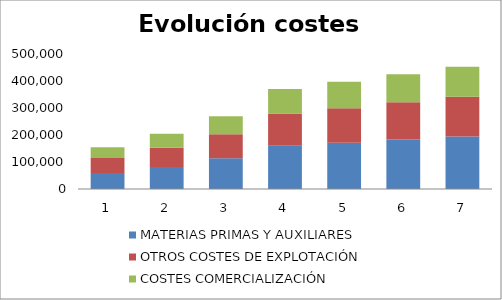
| Category | MATERIAS PRIMAS Y AUXILIARES | OTROS COSTES DE EXPLOTACIÓN | COSTES COMERCIALIZACIÓN |
|---|---|---|---|
| 0 | 59620 | 55100 | 40200 |
| 1 | 81227.56 | 71088.106 | 52510.494 |
| 2 | 113924.999 | 89048.551 | 66583.777 |
| 3 | 160510.225 | 118956.893 | 91237.907 |
| 4 | 171465.548 | 127970.92 | 97595.712 |
| 5 | 183247.989 | 137734.705 | 104431.589 |
| 6 | 194673.764 | 147079.365 | 111004.694 |